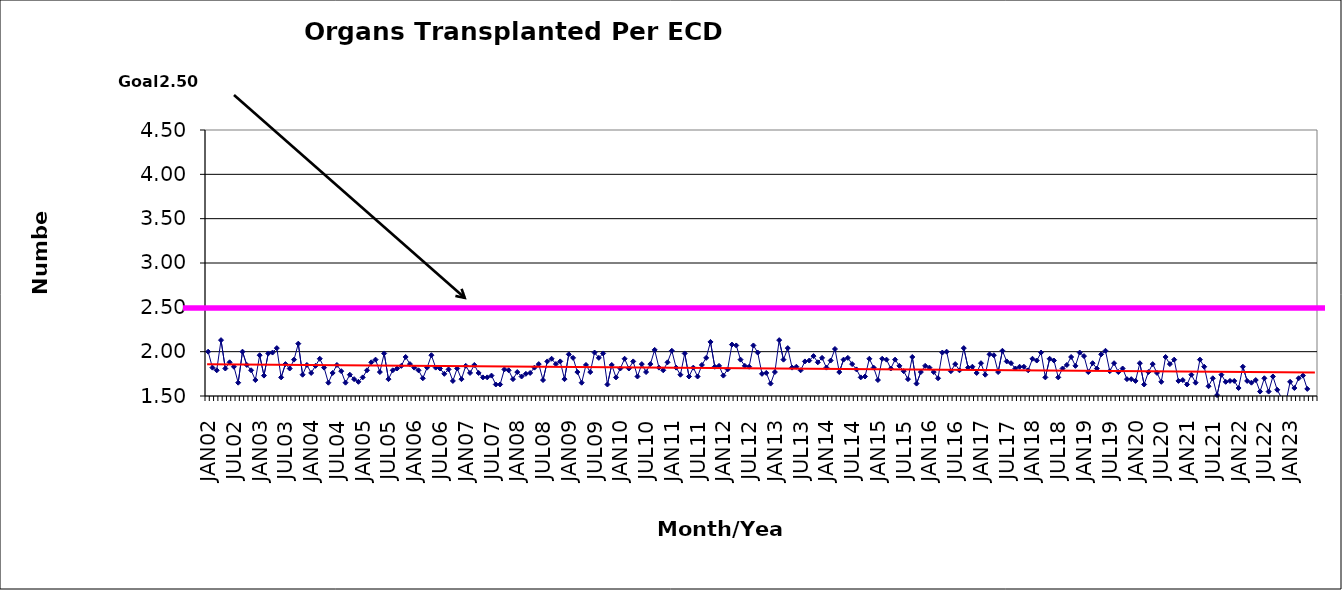
| Category | Series 0 |
|---|---|
| JAN02 | 2 |
| FEB02 | 1.82 |
| MAR02 | 1.79 |
| APR02 | 2.13 |
| MAY02 | 1.81 |
| JUN02 | 1.88 |
| JUL02 | 1.83 |
| AUG02 | 1.65 |
| SEP02 | 2 |
| OCT02 | 1.85 |
| NOV02 | 1.79 |
| DEC02 | 1.68 |
| JAN03 | 1.96 |
| FEB03 | 1.73 |
| MAR03 | 1.98 |
| APR03 | 1.99 |
| MAY03 | 2.04 |
| JUN03 | 1.71 |
| JUL03 | 1.86 |
| AUG03 | 1.81 |
| SEP03 | 1.91 |
| OCT03 | 2.09 |
| NOV03 | 1.74 |
| DEC03 | 1.85 |
| JAN04 | 1.76 |
| FEB04 | 1.84 |
| MAR04 | 1.92 |
| APR04 | 1.82 |
| MAY04 | 1.65 |
| JUN04 | 1.76 |
| JUL04 | 1.85 |
| AUG04 | 1.78 |
| SEP04 | 1.65 |
| OCT04 | 1.74 |
| NOV04 | 1.69 |
| DEC04 | 1.66 |
| JAN05 | 1.71 |
| FEB05 | 1.79 |
| MAR05 | 1.88 |
| APR05 | 1.91 |
| MAY05 | 1.77 |
| JUN05 | 1.98 |
| JUL05 | 1.69 |
| AUG05 | 1.79 |
| SEP05 | 1.81 |
| OCT05 | 1.84 |
| NOV05 | 1.94 |
| DEC05 | 1.86 |
| JAN06 | 1.82 |
| FEB06 | 1.79 |
| MAR06 | 1.7 |
| APR06 | 1.82 |
| MAY06 | 1.96 |
| JUN06 | 1.82 |
| JUL06 | 1.81 |
| AUG06 | 1.75 |
| SEP06 | 1.8 |
| OCT06 | 1.67 |
| NOV06 | 1.81 |
| DEC06 | 1.69 |
| JAN07 | 1.84 |
| FEB07 | 1.76 |
| MAR07 | 1.85 |
| APR07 | 1.76 |
| MAY07 | 1.71 |
| JUN07 | 1.71 |
| JUL07 | 1.73 |
| AUG07 | 1.63 |
| SEP07 | 1.63 |
| OCT07 | 1.8 |
| NOV07 | 1.79 |
| DEC07 | 1.69 |
| JAN08 | 1.77 |
| FEB08 | 1.72 |
| MAR08 | 1.75 |
| APR08 | 1.76 |
| MAY08 | 1.82 |
| JUN08 | 1.86 |
| JUL08 | 1.68 |
| AUG08 | 1.89 |
| SEP08 | 1.92 |
| OCT08 | 1.86 |
| NOV08 | 1.89 |
| DEC08 | 1.69 |
| JAN09 | 1.97 |
| FEB09 | 1.93 |
| MAR09 | 1.77 |
| APR09 | 1.65 |
| MAY09 | 1.85 |
| JUN09 | 1.77 |
| JUL09 | 1.99 |
| AUG09 | 1.93 |
| SEP09 | 1.98 |
| OCT09 | 1.63 |
| NOV09 | 1.85 |
| DEC09 | 1.71 |
| JAN10 | 1.81 |
| FEB10 | 1.92 |
| MAR10 | 1.81 |
| APR10 | 1.89 |
| MAY10 | 1.72 |
| JUN10 | 1.86 |
| JUL10 | 1.77 |
| AUG10 | 1.86 |
| SEP10 | 2.02 |
| OCT10 | 1.82 |
| NOV10 | 1.79 |
| DEC10 | 1.88 |
| JAN11 | 2.01 |
| FEB11 | 1.82 |
| MAR11 | 1.74 |
| APR11 | 1.98 |
| MAY11 | 1.72 |
| JUN11 | 1.82 |
| JUL11 | 1.72 |
| AUG11 | 1.85 |
| SEP11 | 1.93 |
| OCT11 | 2.11 |
| NOV11 | 1.83 |
| DEC11 | 1.84 |
| JAN12 | 1.73 |
| FEB12 | 1.8 |
| MAR12 | 2.08 |
| APR12 | 2.07 |
| MAY12 | 1.91 |
| JUN12 | 1.84 |
| JUL12 | 1.83 |
| AUG12 | 2.07 |
| SEP12 | 1.99 |
| OCT12 | 1.75 |
| NOV12 | 1.76 |
| DEC12 | 1.64 |
| JAN13 | 1.77 |
| FEB13 | 2.13 |
| MAR13 | 1.91 |
| APR13 | 2.04 |
| MAY13 | 1.82 |
| JUN13 | 1.83 |
| JUL13 | 1.79 |
| AUG13 | 1.89 |
| SEP13 | 1.9 |
| OCT13 | 1.95 |
| NOV13 | 1.88 |
| DEC13 | 1.93 |
| JAN14 | 1.82 |
| FEB14 | 1.9 |
| MAR14 | 2.03 |
| APR14 | 1.77 |
| MAY14 | 1.91 |
| JUN14 | 1.93 |
| JUL14 | 1.86 |
| AUG14 | 1.8 |
| SEP14 | 1.71 |
| OCT14 | 1.72 |
| NOV14 | 1.92 |
| DEC14 | 1.82 |
| JAN15 | 1.68 |
| FEB15 | 1.92 |
| MAR15 | 1.91 |
| APR15 | 1.81 |
| MAY15 | 1.91 |
| JUN15 | 1.84 |
| JUL15 | 1.78 |
| AUG15 | 1.69 |
| SEP15 | 1.94 |
| OCT15 | 1.64 |
| NOV15 | 1.77 |
| DEC15 | 1.84 |
| JAN16 | 1.82 |
| FEB16 | 1.77 |
| MAR16 | 1.7 |
| APR16 | 1.99 |
| MAY16 | 2 |
| JUN16 | 1.78 |
| JUL16 | 1.86 |
| AUG16 | 1.79 |
| SEP16 | 2.04 |
| OCT16 | 1.82 |
| NOV16 | 1.83 |
| DEC16 | 1.76 |
| JAN17 | 1.87 |
| FEB17 | 1.74 |
| MAR17 | 1.97 |
| APR17 | 1.96 |
| MAY17 | 1.77 |
| JUN17 | 2.01 |
| JUL17 | 1.89 |
| AUG17 | 1.87 |
| SEP17 | 1.81 |
| OCT17 | 1.83 |
| NOV17 | 1.83 |
| DEC17 | 1.79 |
| JAN18 | 1.92 |
| FEB18 | 1.9 |
| MAR18 | 1.99 |
| APR18 | 1.71 |
| MAY18 | 1.92 |
| JUN18 | 1.9 |
| JUL18 | 1.71 |
| AUG18 | 1.81 |
| SEP18 | 1.85 |
| OCT18 | 1.94 |
| NOV18 | 1.84 |
| DEC18 | 1.99 |
| JAN19 | 1.95 |
| FEB19 | 1.77 |
| MAR19 | 1.87 |
| APR19 | 1.81 |
| MAY19 | 1.97 |
| JUN19 | 2.01 |
| JUL19 | 1.78 |
| AUG19 | 1.87 |
| SEP19 | 1.77 |
| OCT19 | 1.81 |
| NOV19 | 1.69 |
| DEC19 | 1.69 |
| JAN20 | 1.67 |
| FEB20 | 1.87 |
| MAR20 | 1.63 |
| APR20 | 1.77 |
| MAY20 | 1.86 |
| JUN20 | 1.76 |
| JUL20 | 1.66 |
| AUG20 | 1.94 |
| SEP20 | 1.86 |
| OCT20 | 1.91 |
| NOV20 | 1.67 |
| DEC20 | 1.68 |
| JAN21 | 1.63 |
| FEB21 | 1.74 |
| MAR21 | 1.65 |
| APR21 | 1.91 |
| MAY21 | 1.83 |
| JUN21 | 1.61 |
| JUL21 | 1.7 |
| AUG21 | 1.51 |
| SEP21 | 1.74 |
| OCT21 | 1.66 |
| NOV21 | 1.67 |
| DEC21 | 1.67 |
| JAN22 | 1.59 |
| FEB22 | 1.83 |
| MAR22 | 1.67 |
| APR22 | 1.65 |
| MAY22 | 1.68 |
| JUN22 | 1.55 |
| JUL22 | 1.7 |
| AUG22 | 1.55 |
| SEP22 | 1.72 |
| OCT22 | 1.57 |
| NOV22 | 1.48 |
| DEC22 | 1.42 |
| JAN23 | 1.66 |
| FEB23 | 1.59 |
| MAR23 | 1.7 |
| APR23 | 1.73 |
| MAY23 | 1.58 |